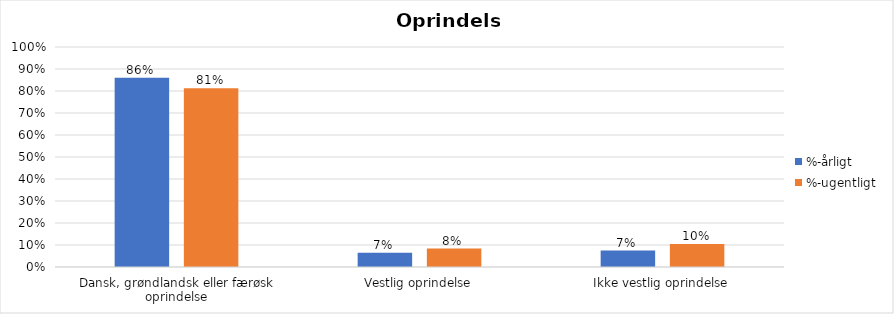
| Category | %-årligt | %-ugentligt |
|---|---|---|
| Dansk, grøndlandsk eller færøsk oprindelse | 0.86 | 0.812 |
| Vestlig oprindelse | 0.065 | 0.084 |
| Ikke vestlig oprindelse | 0.075 | 0.104 |